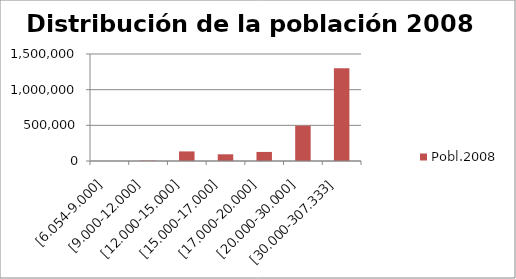
| Category | Pobl.2008 |
|---|---|
| [6.054-9.000] | 396 |
| [9.000-12.000] | 5177 |
| [12.000-15.000] | 134319 |
| [15.000-17.000] | 93927 |
| [17.000-20.000] | 126996 |
| [20.000-30.000] | 495403 |
| [30.000-307.333] | 1300895 |